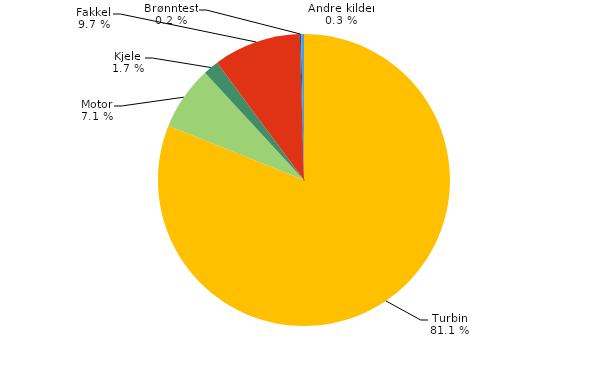
| Category | Series 0 |
|---|---|
| Turbin | 10929.706 |
| Motor | 955.419 |
| Kjele | 230.151 |
| Fakkel | 1306.594 |
| Brønntest | 20.231 |
| Andre kilder | 42.228 |